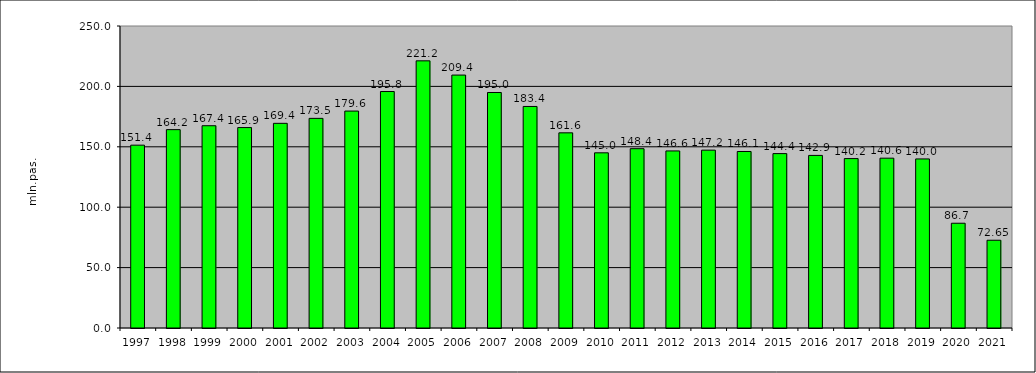
| Category | passengers transported (mill pas.) |
|---|---|
| 1997.0 | 151.353 |
| 1998.0 | 164.213 |
| 1999.0 | 167.439 |
| 2000.0 | 165.917 |
| 2001.0 | 169.429 |
| 2002.0 | 173.532 |
| 2003.0 | 179.572 |
| 2004.0 | 195.756 |
| 2005.0 | 221.168 |
| 2006.0 | 209.381 |
| 2007.0 | 194.955 |
| 2008.0 | 183.39 |
| 2009.0 | 161.559 |
| 2010.0 | 145.021 |
| 2011.0 | 148.448 |
| 2012.0 | 146.587 |
| 2013.0 | 147.216 |
| 2014.0 | 146.114 |
| 2015.0 | 144.374 |
| 2016.0 | 142.871 |
| 2017.0 | 140.249 |
| 2018.0 | 140.583 |
| 2019.0 | 139.955 |
| 2020.0 | 86.725 |
| 2021.0 | 72.65 |